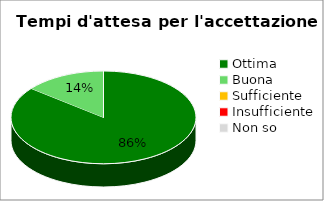
| Category | Series 0 |
|---|---|
| Ottima | 30 |
| Buona | 5 |
| Sufficiente | 0 |
| Insufficiente | 0 |
| Non so | 0 |